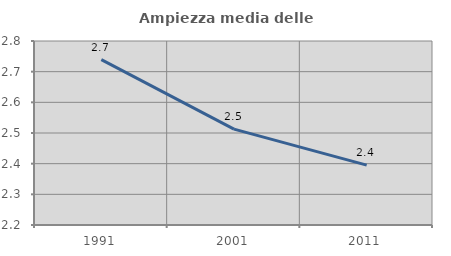
| Category | Ampiezza media delle famiglie |
|---|---|
| 1991.0 | 2.739 |
| 2001.0 | 2.513 |
| 2011.0 | 2.395 |